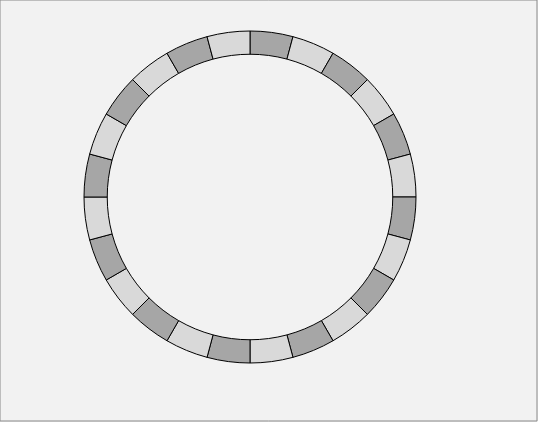
| Category | Series 0 |
|---|---|
| 0 h | 1 |
| 1 h | 1 |
| 2 h | 1 |
| 3 h | 1 |
| 4 h | 1 |
| 5 h | 1 |
| 6 h | 1 |
| 7 h | 1 |
| 8 h | 1 |
| 9 h | 1 |
| 10 h | 1 |
| 11 h | 1 |
| 12 h | 1 |
| 13 h | 1 |
| 14 h | 1 |
| 15 h | 1 |
| 16 h | 1 |
| 17 h | 1 |
| 18 h | 1 |
| 19 h | 1 |
| 20 h | 1 |
| 21 h | 1 |
| 22 h | 1 |
| 23 h | 1 |